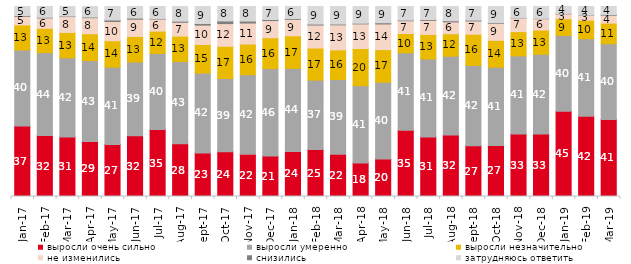
| Category | выросли очень сильно | выросли умеренно | выросли незначительно | не изменились | снизились | затрудняюсь ответить |
|---|---|---|---|---|---|---|
| 2017-01-01 | 37.15 | 39.95 | 13.2 | 4.55 | 0.4 | 4.75 |
| 2017-02-01 | 32.05 | 43.7 | 12.75 | 5.5 | 0.3 | 5.7 |
| 2017-03-01 | 31.3 | 41.7 | 13.35 | 8.35 | 0.25 | 5.05 |
| 2017-04-01 | 28.95 | 42.6 | 14.1 | 8.45 | 0.35 | 5.55 |
| 2017-05-01 | 27.4 | 40.65 | 13.95 | 10.1 | 0.8 | 7.1 |
| 2017-06-01 | 31.95 | 38.85 | 13.45 | 9.05 | 0.6 | 6.1 |
| 2017-07-01 | 35.25 | 40.05 | 11.75 | 6.25 | 0.25 | 6.45 |
| 2017-08-01 | 27.7 | 43.35 | 13.35 | 7.3 | 0.6 | 7.7 |
| 2017-09-01 | 22.95 | 42 | 15.05 | 10.2 | 0.85 | 8.95 |
| 2017-10-01 | 23.6 | 38.5 | 16.95 | 11.95 | 1.4 | 7.6 |
| 2017-11-01 | 22.25 | 41.8 | 16.15 | 11.05 | 1.05 | 7.65 |
| 2017-12-01 | 21.35 | 45.95 | 16.25 | 9.05 | 0.55 | 6.85 |
| 2018-01-01 | 23.75 | 43.7 | 17.15 | 8.65 | 0.45 | 6.3 |
| 2018-02-01 | 24.7 | 36.55 | 16.9 | 12.1 | 0.5 | 9.25 |
| 2018-03-01 | 22.25 | 39.3 | 15.6 | 13.2 | 0.4 | 9.25 |
| 2018-04-01 | 17.65 | 40.65 | 19.55 | 13 | 0.35 | 8.8 |
| 2018-05-01 | 19.75 | 40.4 | 17.15 | 13.5 | 0.65 | 8.55 |
| 2018-06-01 | 34.85 | 40.8 | 10.15 | 6.7 | 0.35 | 7.15 |
| 2018-07-01 | 31.3 | 41.05 | 12.9 | 7.4 | 0.45 | 6.85 |
| 2018-08-01 | 32.35 | 41.5 | 11.8 | 6.25 | 0.6 | 7.5 |
| 2018-09-01 | 26.7 | 42.3 | 16.4 | 7 | 0.45 | 7.15 |
| 2018-10-01 | 26.9 | 41.15 | 14.15 | 8.9 | 0.35 | 8.55 |
| 2018-11-01 | 32.934 | 41.068 | 12.774 | 7.036 | 0.1 | 6.088 |
| 2018-12-01 | 32.85 | 42 | 12.75 | 5.95 | 0.2 | 6.25 |
| 2019-01-01 | 44.85 | 39.95 | 8.75 | 2.6 | 0.2 | 3.65 |
| 2019-02-01 | 42.2 | 40.85 | 9.75 | 2.7 | 0.1 | 4.4 |
| 2019-03-01 | 40.527 | 39.881 | 10.84 | 4.177 | 0.348 | 4.227 |